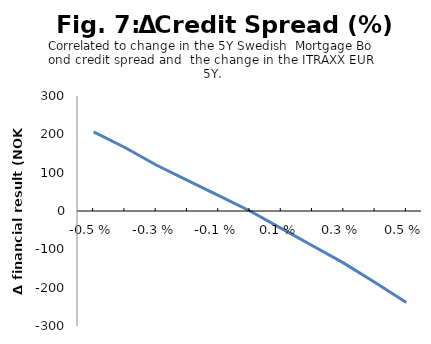
| Category | Series 0 |
|---|---|
| -0.005 | 206.55 |
| -0.004 | 165.606 |
| -0.003 | 119.947 |
| -0.002 | 79.965 |
| -0.001 | 39.982 |
| 0.0 | 0 |
| 0.001 | -45.336 |
| 0.002 | -90.672 |
| 0.003 | -136.008 |
| 0.004 | -186.381 |
| 0.005 | -238.576 |